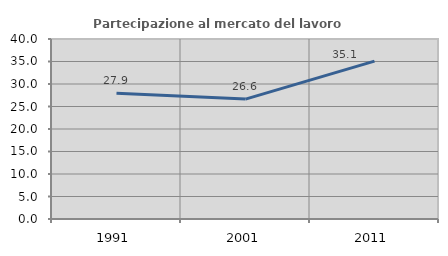
| Category | Partecipazione al mercato del lavoro  femminile |
|---|---|
| 1991.0 | 27.926 |
| 2001.0 | 26.646 |
| 2011.0 | 35.085 |